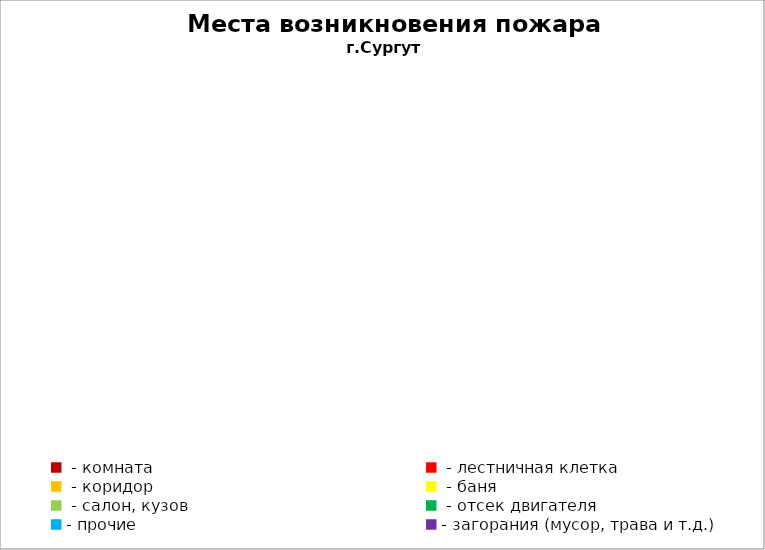
| Category | Места возникновения пожара |
|---|---|
|  - комната | 97 |
|  - лестничная клетка | 19 |
|  - коридор | 15 |
|  - баня | 51 |
|  - салон, кузов | 31 |
|  - отсек двигателя | 66 |
| - прочие | 134 |
| - загорания (мусор, трава и т.д.)  | 202 |